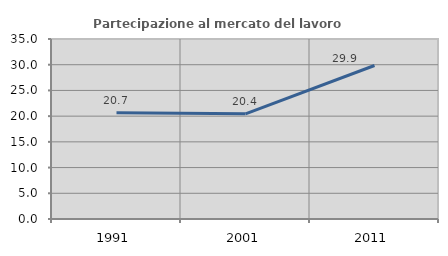
| Category | Partecipazione al mercato del lavoro  femminile |
|---|---|
| 1991.0 | 20.66 |
| 2001.0 | 20.447 |
| 2011.0 | 29.851 |